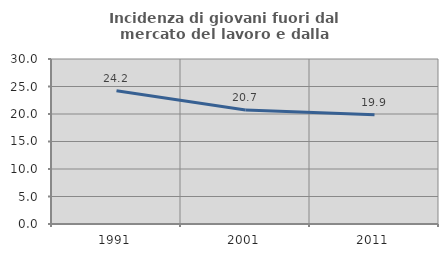
| Category | Incidenza di giovani fuori dal mercato del lavoro e dalla formazione  |
|---|---|
| 1991.0 | 24.242 |
| 2001.0 | 20.73 |
| 2011.0 | 19.876 |